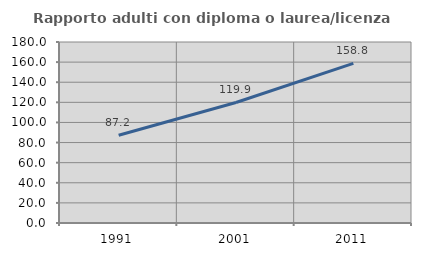
| Category | Rapporto adulti con diploma o laurea/licenza media  |
|---|---|
| 1991.0 | 87.243 |
| 2001.0 | 119.874 |
| 2011.0 | 158.771 |